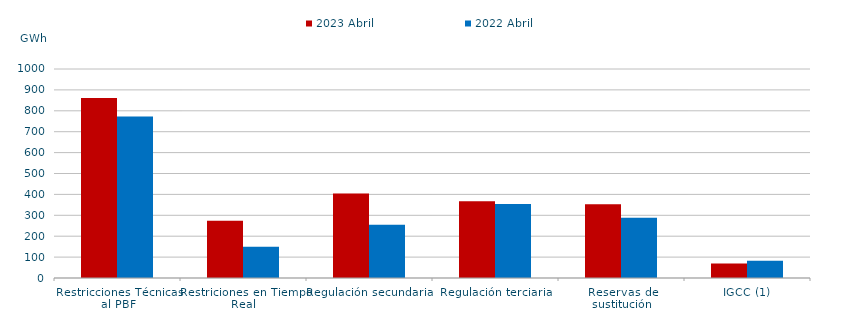
| Category | 2023 Abril | 2022 Abril |
|---|---|---|
| Restricciones Técnicas al PBF | 860.759 | 772.696 |
| Restriciones en Tiempo Real | 274.428 | 149.417 |
| Regulación secundaria | 404.863 | 255.314 |
| Regulación terciaria | 366.847 | 353.547 |
| Reservas de sustitución | 353.07 | 288.305 |
| IGCC (1) | 69.518 | 83.099 |